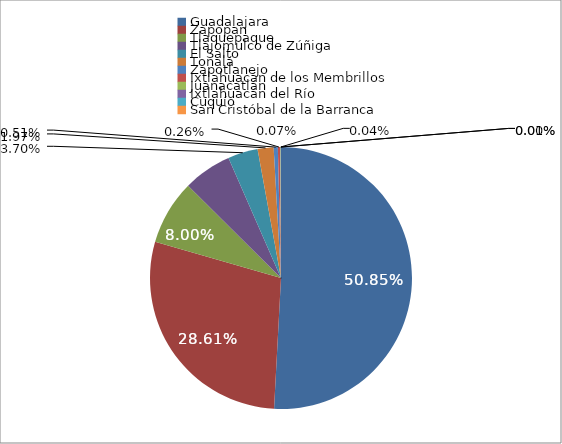
| Category | Series 0 |
|---|---|
| Guadalajara | 710782 |
| Zapopan | 399974 |
| Tlaquepaque | 111829 |
| Tlajomulco de Zúñiga | 83611 |
| El Salto | 51698 |
| Tonalá | 27553 |
| Zapotlanejo | 7157 |
| Ixtlahuacán de los Membrillos | 3654 |
| Juanacatlán | 1035 |
| Ixtlahuacán del Río | 479 |
| Cuquío | 162 |
| San Cristóbal de la Barranca | 26 |